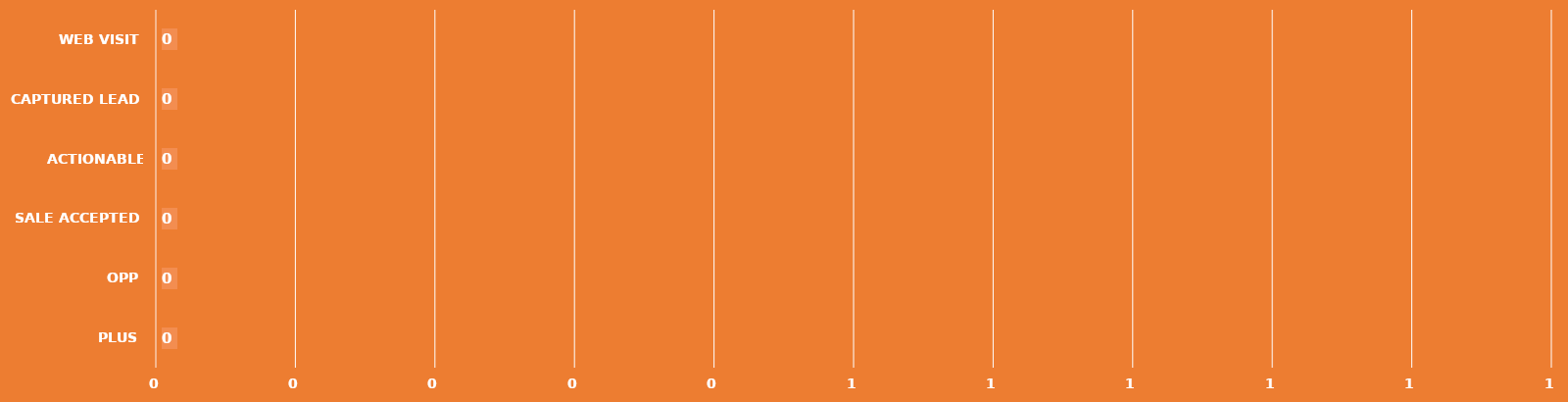
| Category | Series 0 |
|---|---|
| PLUS | 0 |
| OPP | 0 |
| SALE ACCEPTED | 0 |
| ACTIONABLE LEAD | 0 |
| CAPTURED LEAD | 0 |
| WEB VISIT | 0 |